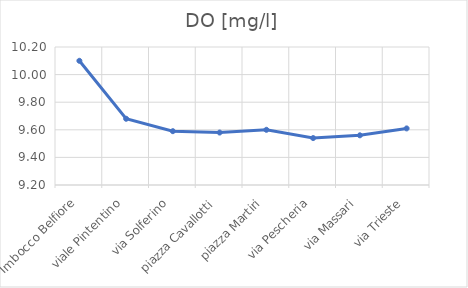
| Category | DO [mg/l] |
|---|---|
| Imbocco Belfiore | 10.1 |
| viale Pintentino | 9.68 |
| via Solferino | 9.59 |
| piazza Cavallotti | 9.58 |
| piazza Martiri | 9.6 |
| via Pescheria | 9.54 |
| via Massari | 9.56 |
| via Trieste | 9.61 |